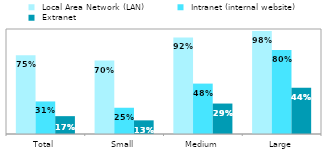
| Category |  Local Area Network (LAN) |  Intranet (internal website) |  Extranet |
|---|---|---|---|
| Total | 0.75 | 0.31 | 0.17 |
| Small | 0.7 | 0.25 | 0.13 |
| Medium | 0.92 | 0.48 | 0.29 |
| Large | 0.98 | 0.8 | 0.44 |